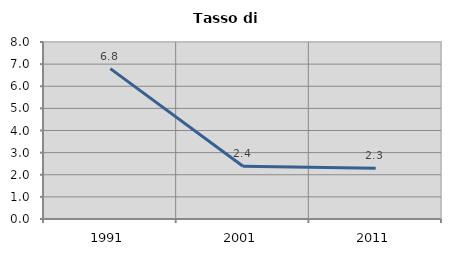
| Category | Tasso di disoccupazione   |
|---|---|
| 1991.0 | 6.796 |
| 2001.0 | 2.381 |
| 2011.0 | 2.299 |